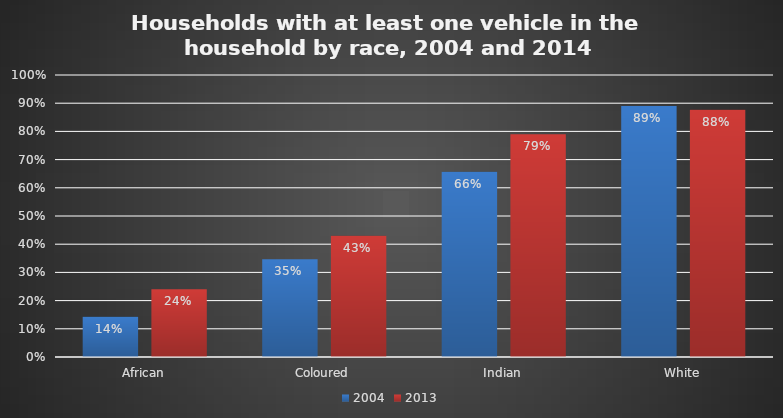
| Category | 2004 | 2013 |
|---|---|---|
| African | 0.142 | 0.24 |
| Coloured | 0.347 | 0.43 |
| Indian | 0.657 | 0.79 |
| White | 0.89 | 0.876 |